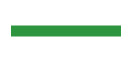
| Category | Series 0 | Series 1 |
|---|---|---|
| 0 | 0 | 0 |
| 1 | 1 | 0 |
| 2 | 0 | 0 |